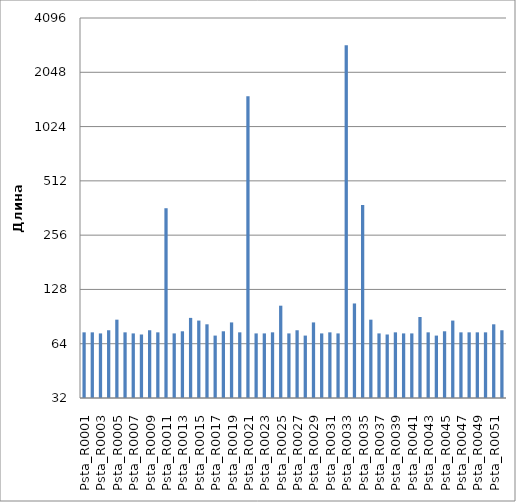
| Category | Total |
|---|---|
| Psta_R0001 | 74 |
| Psta_R0002 | 74 |
| Psta_R0003 | 73 |
| Psta_R0004 | 76 |
| Psta_R0005 | 87 |
| Psta_R0006 | 74 |
| Psta_R0007 | 73 |
| Psta_R0008 | 72 |
| Psta_R0009 | 76 |
| Psta_R0010 | 74 |
| Psta_R0011 | 361 |
| Psta_R0012 | 73 |
| Psta_R0013 | 75 |
| Psta_R0014 | 89 |
| Psta_R0015 | 86 |
| Psta_R0016 | 82 |
| Psta_R0017 | 71 |
| Psta_R0018 | 75 |
| Psta_R0019 | 84 |
| Psta_R0020 | 74 |
| Psta_R0021 | 1510 |
| Psta_R0022 | 73 |
| Psta_R0023 | 73 |
| Psta_R0024 | 74 |
| Psta_R0025 | 104 |
| Psta_R0026 | 73 |
| Psta_R0027 | 76 |
| Psta_R0028 | 71 |
| Psta_R0029 | 84 |
| Psta_R0030 | 73 |
| Psta_R0031 | 74 |
| Psta_R0032 | 73 |
| Psta_R0033 | 2889 |
| Psta_R0034 | 107 |
| Psta_R0035 | 376 |
| Psta_R0036 | 87 |
| Psta_R0037 | 73 |
| Psta_R0038 | 72 |
| Psta_R0039 | 74 |
| Psta_R0040 | 73 |
| Psta_R0041 | 73 |
| Psta_R0042 | 90 |
| Psta_R0043 | 74 |
| Psta_R0044 | 71 |
| Psta_R0045 | 75 |
| Psta_R0046 | 86 |
| Psta_R0047 | 74 |
| Psta_R0048 | 74 |
| Psta_R0049 | 74 |
| Psta_R0050 | 74 |
| Psta_R0051 | 82 |
| Psta_R0052 | 76 |